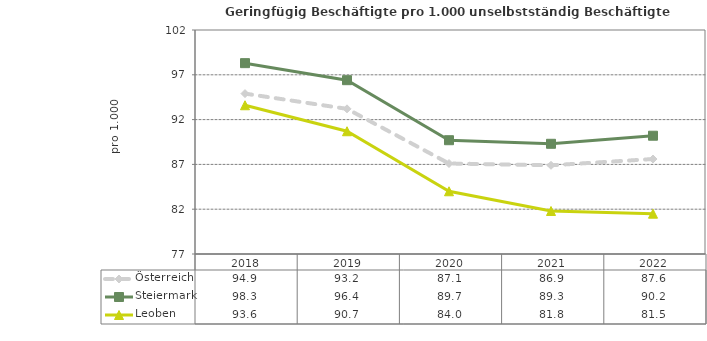
| Category | Österreich | Steiermark | Leoben |
|---|---|---|---|
| 2022.0 | 87.6 | 90.2 | 81.5 |
| 2021.0 | 86.9 | 89.3 | 81.8 |
| 2020.0 | 87.1 | 89.7 | 84 |
| 2019.0 | 93.2 | 96.4 | 90.7 |
| 2018.0 | 94.9 | 98.3 | 93.6 |